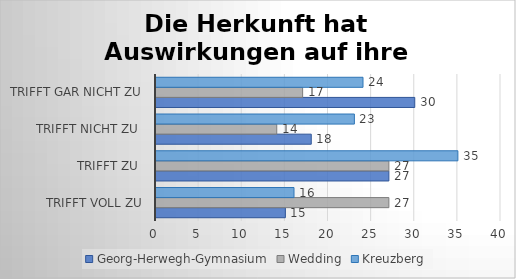
| Category | Georg-Herwegh-Gymnasium | Wedding | Kreuzberg |
|---|---|---|---|
| trifft voll zu | 15 | 27 | 16 |
| trifft zu  | 27 | 27 | 35 |
| trifft nicht zu  | 18 | 14 | 23 |
| trifft gar nicht zu | 30 | 17 | 24 |